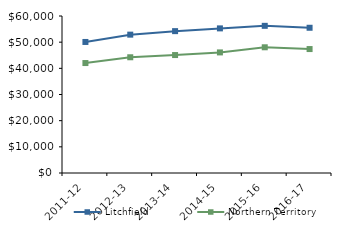
| Category | Litchfield | Northern Territory |
|---|---|---|
| 2011-12 | 50078.5 | 42021 |
| 2012-13 | 52872.55 | 44232.02 |
| 2013-14 | 54216.05 | 45075.51 |
| 2014-15 | 55268.83 | 46083.65 |
| 2015-16 | 56242 | 48046.27 |
| 2016-17 | 55505.27 | 47367.05 |